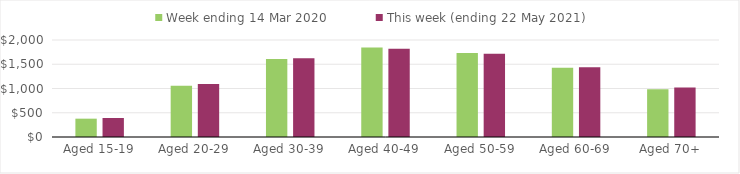
| Category | Week ending 14 Mar 2020 | This week (ending 22 May 2021) |
|---|---|---|
| Aged 15-19 | 377.86 | 392.2 |
| Aged 20-29 | 1055.45 | 1094.97 |
| Aged 30-39 | 1610.42 | 1621.76 |
| Aged 40-49 | 1846.95 | 1819.52 |
| Aged 50-59 | 1732.46 | 1715.42 |
| Aged 60-69 | 1428.92 | 1437.75 |
| Aged 70+ | 982.85 | 1020.86 |